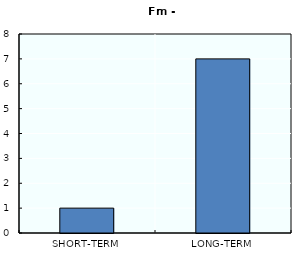
| Category | Series 0 |
|---|---|
| SHORT-TERM | 1 |
| LONG-TERM | 7 |